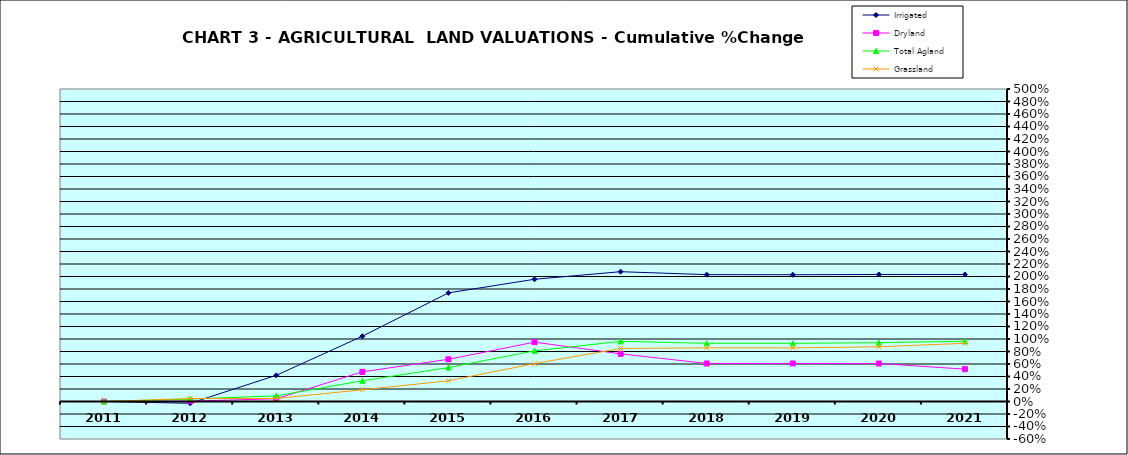
| Category | Irrigated | Dryland | Total Agland | Grassland |
|---|---|---|---|---|
| 2011.0 | 0 | 0 | 0 | 0 |
| 2012.0 | -0.029 | 0.006 | 0.039 | 0.047 |
| 2013.0 | 0.419 | 0.044 | 0.09 | 0.048 |
| 2014.0 | 1.044 | 0.475 | 0.332 | 0.188 |
| 2015.0 | 1.738 | 0.675 | 0.543 | 0.331 |
| 2016.0 | 1.956 | 0.95 | 0.811 | 0.606 |
| 2017.0 | 2.077 | 0.763 | 0.962 | 0.849 |
| 2018.0 | 2.03 | 0.608 | 0.931 | 0.859 |
| 2019.0 | 2.028 | 0.609 | 0.93 | 0.858 |
| 2020.0 | 2.033 | 0.608 | 0.941 | 0.875 |
| 2021.0 | 2.032 | 0.518 | 0.964 | 0.931 |